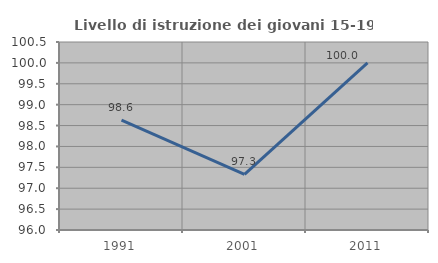
| Category | Livello di istruzione dei giovani 15-19 anni |
|---|---|
| 1991.0 | 98.63 |
| 2001.0 | 97.333 |
| 2011.0 | 100 |